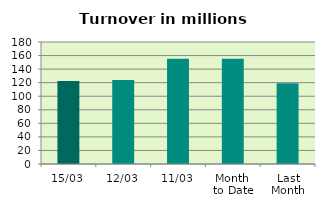
| Category | Series 0 |
|---|---|
| 15/03 | 122.277 |
| 12/03 | 123.957 |
| 11/03 | 155.259 |
| Month 
to Date | 155.407 |
| Last
Month | 119.242 |